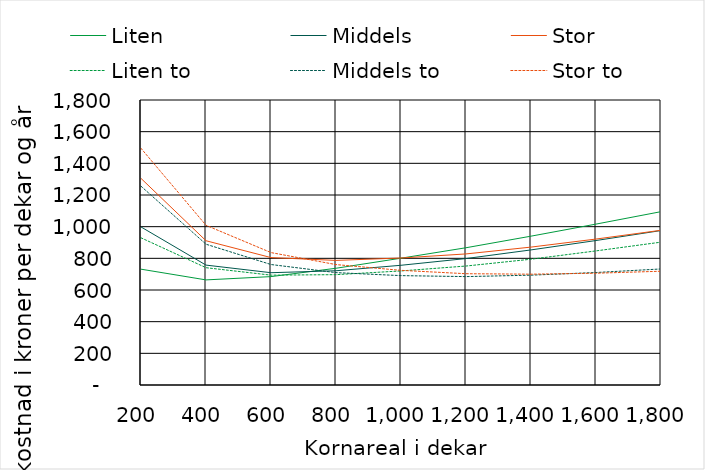
| Category | Liten | Middels | Stor | Liten to | Middels to | Stor to |
|---|---|---|---|---|---|---|
| 200.0 | 731.531 | 998.263 | 1304.873 | 929.623 | 1255.637 | 1494.817 |
| 400.0 | 663.793 | 757.218 | 911.096 | 740.848 | 889.169 | 1008.781 |
| 600.0 | 684.598 | 709.202 | 804.697 | 693.831 | 760.919 | 836.272 |
| 800.0 | 737.281 | 721.527 | 787.019 | 696.866 | 709.781 | 760.516 |
| 1000.0 | 800.858 | 756.126 | 802.068 | 720.403 | 690.791 | 724.113 |
| 1200.0 | 866.888 | 798.645 | 827.775 | 751.356 | 684.595 | 702.879 |
| 1400.0 | 940.031 | 853.143 | 870.98 | 794.398 | 693.685 | 699.936 |
| 1600.0 | 1016.162 | 912.438 | 921.744 | 846.95 | 710.45 | 705.963 |
| 1800.0 | 1094.739 | 975.402 | 977.264 | 902.237 | 732.893 | 718.539 |